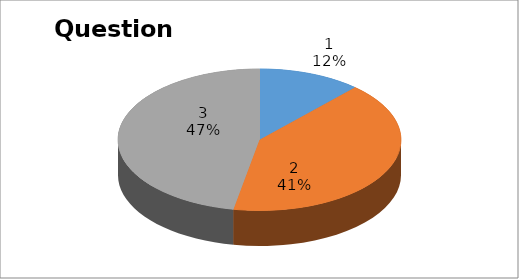
| Category | Series 0 |
|---|---|
| 0 | 2 |
| 1 | 7 |
| 2 | 8 |